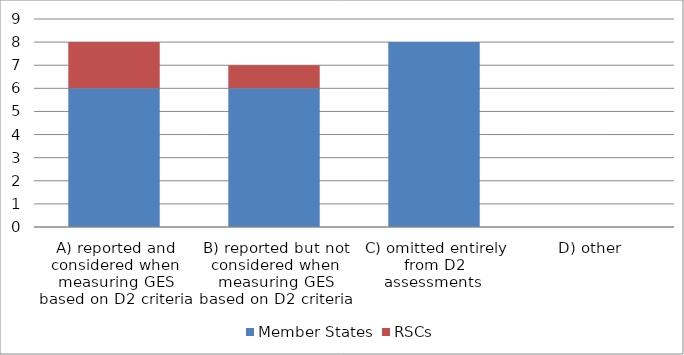
| Category | Member States | RSCs |
|---|---|---|
| A) reported and considered when measuring GES based on D2 criteria | 6 | 2 |
| B) reported but not considered when measuring GES based on D2 criteria | 6 | 1 |
| C) omitted entirely from D2 assessments  | 8 | 0 |
| D) other  | 0 | 0 |